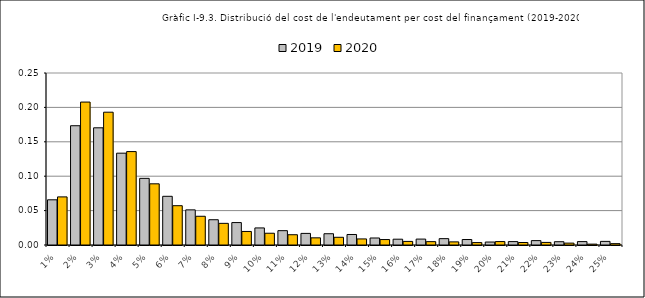
| Category | 2019 | 2020 |
|---|---|---|
| 0.01 | 0.066 | 0.07 |
| 0.02 | 0.173 | 0.208 |
| 0.03 | 0.17 | 0.193 |
| 0.04 | 0.133 | 0.136 |
| 0.05 | 0.097 | 0.089 |
| 0.06 | 0.071 | 0.057 |
| 0.07 | 0.051 | 0.042 |
| 0.08 | 0.037 | 0.031 |
| 0.09 | 0.033 | 0.02 |
| 0.1 | 0.025 | 0.017 |
| 0.11 | 0.021 | 0.015 |
| 0.12 | 0.017 | 0.01 |
| 0.13 | 0.016 | 0.011 |
| 0.14 | 0.015 | 0.009 |
| 0.15 | 0.01 | 0.008 |
| 0.16 | 0.008 | 0.005 |
| 0.17 | 0.009 | 0.005 |
| 0.18 | 0.009 | 0.005 |
| 0.19 | 0.008 | 0.004 |
| 0.2 | 0.004 | 0.005 |
| 0.21 | 0.005 | 0.004 |
| 0.22 | 0.006 | 0.004 |
| 0.23 | 0.005 | 0.003 |
| 0.24 | 0.005 | 0.001 |
| 0.25 | 0.005 | 0.002 |